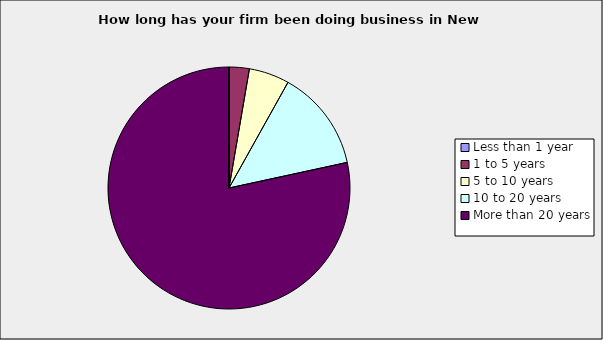
| Category | Series 0 |
|---|---|
| Less than 1 year | 0 |
| 1 to 5 years | 0.027 |
| 5 to 10 years | 0.054 |
| 10 to 20 years | 0.135 |
| More than 20 years | 0.784 |